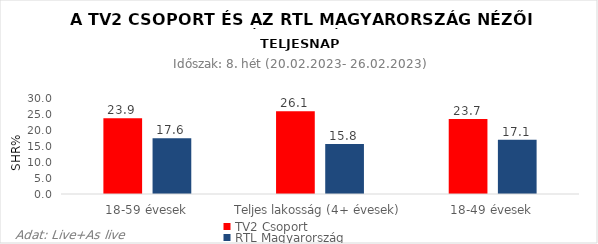
| Category | TV2 Csoport | RTL Magyarország |
|---|---|---|
| 18-59 évesek | 23.9 | 17.6 |
| Teljes lakosság (4+ évesek) | 26.1 | 15.8 |
| 18-49 évesek | 23.7 | 17.1 |